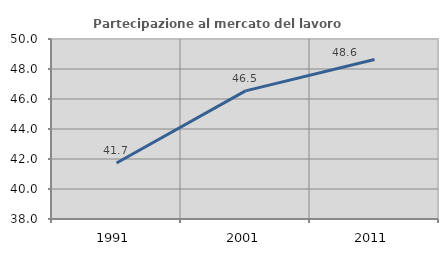
| Category | Partecipazione al mercato del lavoro  femminile |
|---|---|
| 1991.0 | 41.735 |
| 2001.0 | 46.541 |
| 2011.0 | 48.628 |